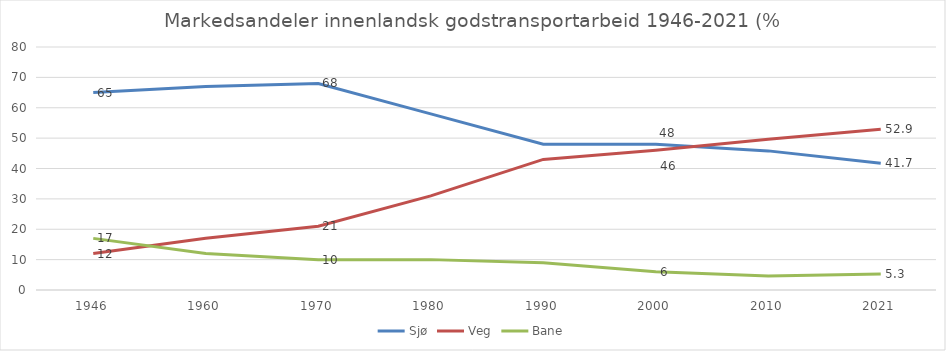
| Category | Sjø | Veg | Bane |
|---|---|---|---|
| 1946.0 | 65 | 12 | 17 |
| 1960.0 | 67 | 17 | 12 |
| 1970.0 | 68 | 21 | 10 |
| 1980.0 | 58 | 31 | 10 |
| 1990.0 | 48 | 43 | 9 |
| 2000.0 | 48 | 46 | 6 |
| 2010.0 | 45.8 | 49.6 | 4.6 |
| 2021.0 | 41.7 | 52.9 | 5.3 |